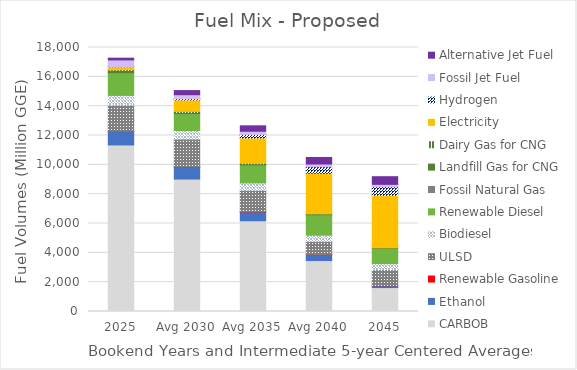
| Category | CARBOB | Ethanol | Renewable Gasoline | ULSD | Biodiesel | Renewable Diesel | Fossil Natural Gas | Landfill Gas for CNG | Dairy Gas for CNG | Electricity | Hydrogen | Fossil Jet Fuel | Alternative Jet Fuel |
|---|---|---|---|---|---|---|---|---|---|---|---|---|---|
| 2025 | 11356.653 | 913.355 | 15.177 | 1803.47 | 644.244 | 1553.802 | 0 | 145.419 | 48.452 | 213.013 | 5.314 | 455.722 | 117.884 |
| Avg 2030 | 9029.604 | 809.369 | 11.253 | 1905.137 | 586.649 | 1151.999 | 0 | 73.799 | 78.374 | 777.105 | 87.448 | 270.503 | 281.901 |
| Avg 2035 | 6183.748 | 609.626 | 11.953 | 1448.602 | 512.807 | 1223.727 | 0 | 73.799 | 42.77 | 1722.918 | 241.867 | 218.216 | 369.876 |
| Avg 2040 | 3473.997 | 404.539 | 13.582 | 879.605 | 435.621 | 1390.493 | 0 | 67.655 | 5.281 | 2762.485 | 436.496 | 186.788 | 445.844 |
| 2045 | 1632.638 | 124.439 | 10.282 | 1086.308 | 410.443 | 1052.585 | 0 | 32.937 | 0 | 3572.892 | 592.954 | 153.398 | 521.812 |